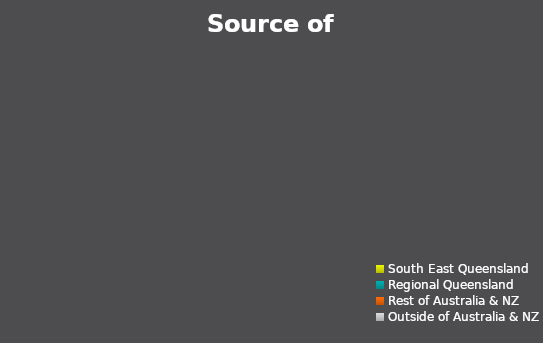
| Category | Series 0 |
|---|---|
| South East Queensland | 0 |
| Regional Queensland | 0 |
| Rest of Australia & NZ | 0 |
| Outside of Australia & NZ | 0 |